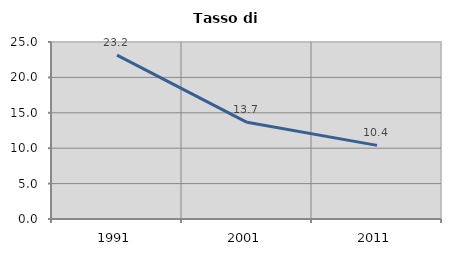
| Category | Tasso di disoccupazione   |
|---|---|
| 1991.0 | 23.155 |
| 2001.0 | 13.658 |
| 2011.0 | 10.402 |